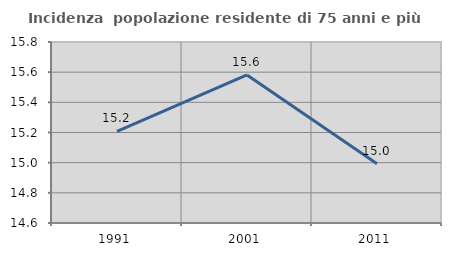
| Category | Incidenza  popolazione residente di 75 anni e più |
|---|---|
| 1991.0 | 15.208 |
| 2001.0 | 15.582 |
| 2011.0 | 14.993 |